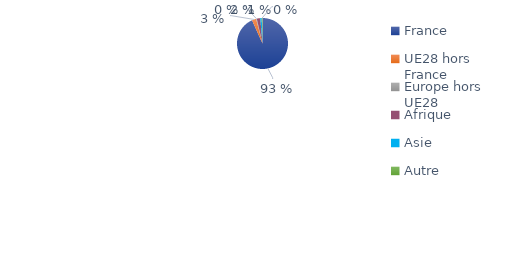
| Category | Series 0 |
|---|---|
| France | 0.933 |
| UE28 hors France | 0.027 |
| Europe hors UE28 | 0.004 |
| Afrique | 0.022 |
| Asie | 0.009 |
| Autre | 0.005 |